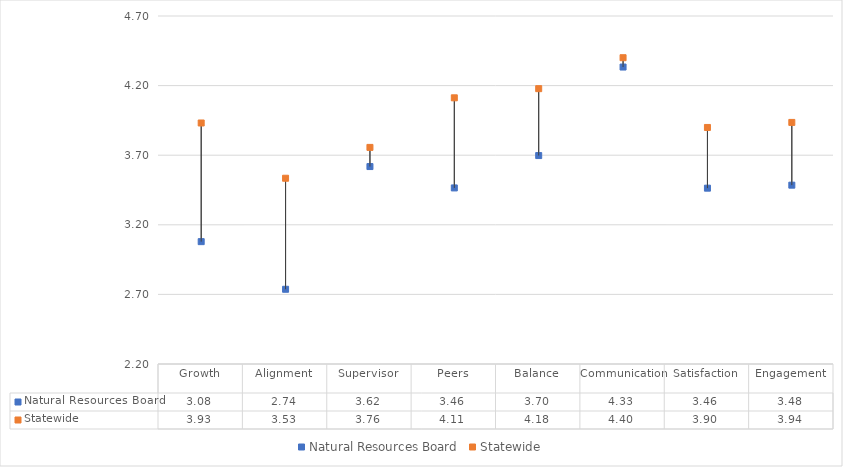
| Category | Natural Resources Board | Statewide |
|---|---|---|
| Growth | 3.079 | 3.931 |
| Alignment | 2.737 | 3.534 |
| Supervisor | 3.618 | 3.756 |
| Peers | 3.465 | 4.112 |
| Balance | 3.697 | 4.178 |
| Communication | 4.333 | 4.4 |
| Satisfaction | 3.463 | 3.899 |
| Engagement | 3.485 | 3.936 |